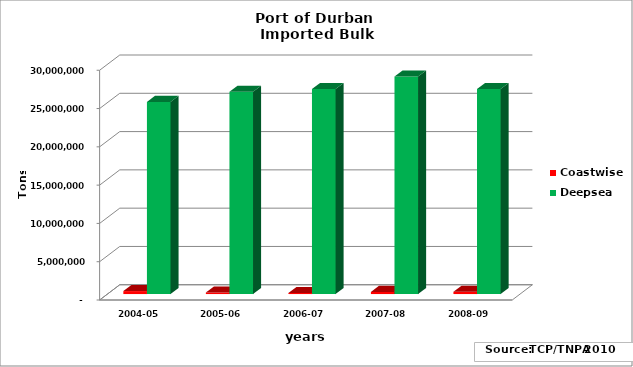
| Category | Coastwise | Deepsea |
|---|---|---|
| 2004-05 | 388657 | 25081664 |
| 2005-06 | 202833 | 26415571 |
| 2006-07 | 136029 | 26777702 |
| 2007-08 | 272736 | 28402286 |
| 2008-09 | 300162 | 26768424 |